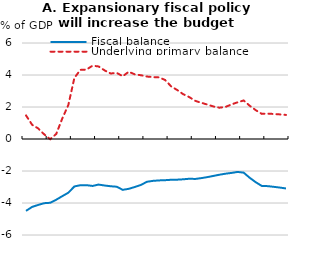
| Category | Fiscal balance | Underlying primary balance |
|---|---|---|
| nan | -4.491 | 1.475 |
| nan | -4.246 | 0.892 |
| 2010.0 | -4.121 | 0.664 |
| nan | -4.012 | 0.293 |
| nan | -3.986 | -0.013 |
| nan | -3.794 | 0.318 |
| nan | -3.572 | 1.283 |
| nan | -3.356 | 2.126 |
| nan | -2.966 | 3.819 |
| nan | -2.888 | 4.322 |
| 2012.0 | -2.885 | 4.336 |
| nan | -2.934 | 4.582 |
| nan | -2.849 | 4.535 |
| nan | -2.907 | 4.289 |
| nan | -2.954 | 4.093 |
| nan | -2.982 | 4.133 |
| nan | -3.178 | 3.923 |
| nan | -3.114 | 4.204 |
| 2014.0 | -2.999 | 4.038 |
| nan | -2.873 | 3.985 |
| nan | -2.674 | 3.904 |
| nan | -2.617 | 3.869 |
| nan | -2.588 | 3.852 |
| nan | -2.575 | 3.69 |
| nan | -2.548 | 3.292 |
| nan | -2.542 | 3.062 |
| 2016.0 | -2.519 | 2.801 |
| nan | -2.484 | 2.621 |
| nan | -2.496 | 2.383 |
| nan | -2.445 | 2.263 |
| nan | -2.381 | 2.151 |
| nan | -2.306 | 2.033 |
| nan | -2.233 | 1.957 |
| nan | -2.168 | 2.006 |
| 2018.0 | -2.12 | 2.163 |
| nan | -2.058 | 2.294 |
| nan | -2.102 | 2.41 |
| nan | -2.424 | 2.077 |
| nan | -2.701 | 1.802 |
| nan | -2.934 | 1.57 |
| nan | -2.947 | 1.587 |
| nan | -2.99 | 1.563 |
| 2020.0 | -3.036 | 1.537 |
| nan | -3.091 | 1.505 |